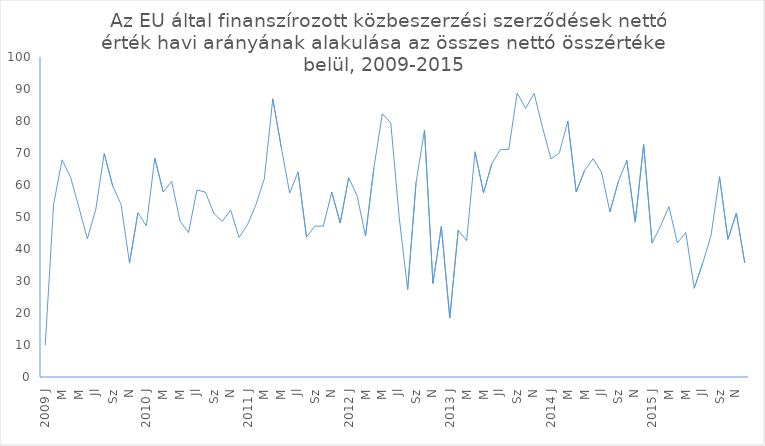
| Category | Series 0 |
|---|---|
| 2009 J | 9.936 |
| F | 54.064 |
| M | 67.841 |
| A | 62.504 |
| M | 52.973 |
| Jn | 43.165 |
| Jl | 52.381 |
| A | 69.85 |
| Sz | 59.693 |
| O | 53.919 |
| N | 35.59 |
| D | 51.339 |
| 2010 J | 47.204 |
| F | 68.42 |
| M | 57.797 |
| A | 61.133 |
| M | 48.751 |
| Jn | 45.115 |
| Jl | 58.429 |
| A | 57.794 |
| Sz | 51.18 |
| O | 48.595 |
| N | 52.202 |
| D | 43.625 |
| 2011 J | 47.617 |
| F | 53.828 |
| M | 61.978 |
| A | 86.938 |
| M | 71.886 |
| Jn | 57.474 |
| Jl | 64.091 |
| A | 43.734 |
| Sz | 47.147 |
| O | 47.154 |
| N | 57.77 |
| D | 48.109 |
| 2012 J | 62.268 |
| F | 56.711 |
| M | 44.04 |
| A | 65.452 |
| M | 82.288 |
| Jn | 79.39 |
| Jl | 49.867 |
| A | 27.312 |
| Sz | 60.816 |
| O | 77.199 |
| N | 29.252 |
| D | 47.038 |
| 2013 J | 18.485 |
| F | 45.915 |
| M | 42.586 |
| A | 70.394 |
| M | 57.577 |
| Jn | 66.757 |
| Jl | 71.016 |
| A | 71.173 |
| Sz | 88.732 |
| O | 83.911 |
| N | 88.639 |
| D | 78.03 |
| 2014 J | 68.171 |
| F | 70.006 |
| M | 79.937 |
| A | 57.806 |
| M | 64.585 |
| Jn | 68.207 |
| Jl | 64.019 |
| A | 51.6 |
| Sz | 61.076 |
| O | 67.714 |
| N | 48.409 |
| D | 72.653 |
| 2015 J | 41.857 |
| F | 47.129 |
| M | 53.277 |
| A | 41.894 |
| M | 45.149 |
| Jn | 27.74 |
| Jl | 35.463 |
| A | 44.264 |
| Sz | 62.6 |
| O | 43.013 |
| N | 51.197 |
| D | 35.659 |